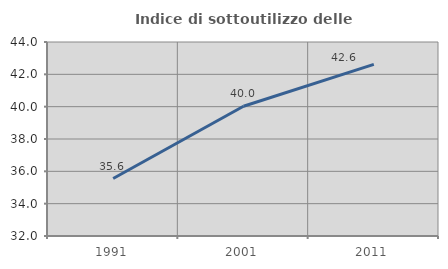
| Category | Indice di sottoutilizzo delle abitazioni  |
|---|---|
| 1991.0 | 35.556 |
| 2001.0 | 40.023 |
| 2011.0 | 42.616 |